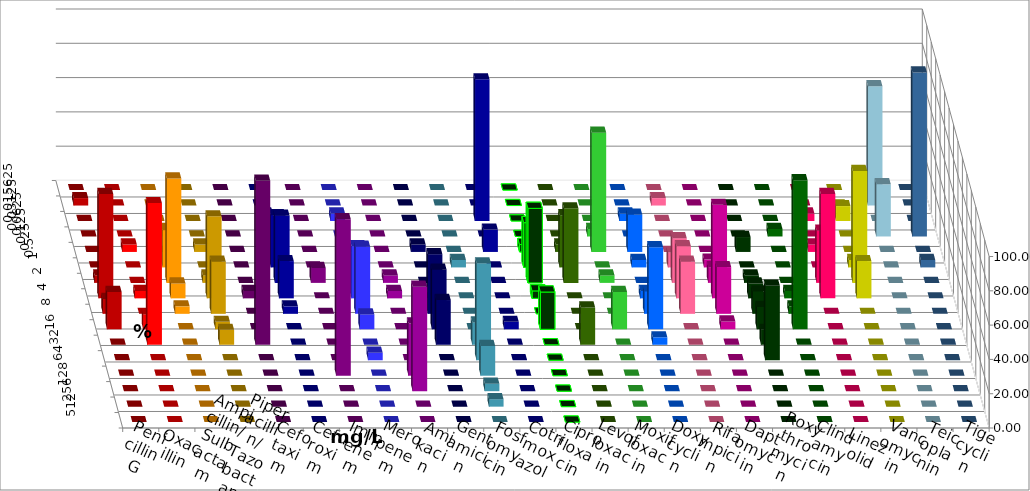
| Category | Penicillin G | Oxacillin | Ampicillin/ Sulbactam | Piperacillin/ Tazobactam | Cefotaxim | Cefuroxim | Imipenem | Meropenem | Amikacin | Gentamicin | Fosfomycin | Cotrimoxazol | Ciprofloxacin | Levofloxacin | Moxifloxacin | Doxycyclin | Rifampicin | Daptomycin | Roxythromycin | Clindamycin | Linezolid | Vancomycin | Teicoplanin | Tigecyclin |
|---|---|---|---|---|---|---|---|---|---|---|---|---|---|---|---|---|---|---|---|---|---|---|---|---|
| 0.015625 | 0 | 0 | 0 | 0 | 0 | 0 | 0 | 0 | 0 | 0 | 0 | 0 | 0 | 0 | 0 | 0 | 0 | 0 | 0 | 0 | 0 | 0 | 0 | 0 |
| 0.03125 | 4.348 | 0 | 0 | 0 | 0 | 0 | 0 | 0 | 0 | 0 | 0 | 0 | 0 | 0 | 0 | 0 | 4.348 | 0 | 0 | 0 | 0 | 0 | 0 | 69.565 |
| 0.0625 | 0 | 0 | 0 | 0 | 0 | 0 | 4.348 | 4.348 | 0 | 0 | 0 | 82.609 | 0 | 0 | 0 | 4.348 | 0 | 0 | 0 | 0 | 4.348 | 8.696 | 0 | 0 |
| 0.125 | 0 | 0 | 4.348 | 0 | 0 | 0 | 0 | 0 | 0 | 0 | 0 | 0 | 0 | 0 | 4.348 | 0 | 0 | 0 | 0 | 4.348 | 0 | 0 | 95.652 | 30.435 |
| 0.25 | 0 | 4.348 | 0 | 4.348 | 0 | 0 | 0 | 0 | 0 | 4.348 | 0 | 13.043 | 4.348 | 4.348 | 69.565 | 21.739 | 0 | 0 | 8.696 | 0 | 4.348 | 0 | 0 | 0 |
| 0.5 | 0 | 0 | 21.739 | 0 | 0 | 0 | 30.435 | 4.348 | 0 | 0 | 4.348 | 0 | 26.087 | 30.435 | 0 | 4.348 | 8.696 | 4.545 | 0 | 0 | 0 | 4.348 | 4.348 | 0 |
| 1.0 | 4.348 | 0 | 60.87 | 4.348 | 0 | 8.696 | 39.13 | 8.696 | 4.348 | 0 | 0 | 0 | 43.478 | 43.478 | 4.348 | 0 | 26.087 | 9.091 | 4.348 | 0 | 30.435 | 65.217 | 0 | 0 |
| 2.0 | 60.87 | 4.348 | 8.696 | 47.826 | 4.348 | 0 | 21.739 | 30.435 | 4.348 | 0 | 0 | 0 | 4.348 | 0 | 0 | 4.348 | 30.435 | 54.545 | 8.696 | 4.348 | 60.87 | 21.739 | 0 | 0 |
| 4.0 | 8.696 | 0 | 4.348 | 30.435 | 0 | 0 | 4.348 | 39.13 | 0 | 34.783 | 0 | 0 | 0 | 0 | 0 | 13.043 | 30.435 | 27.273 | 13.043 | 4.348 | 0 | 0 | 0 | 0 |
| 8.0 | 21.739 | 8.696 | 0 | 4.348 | 0 | 0 | 0 | 8.696 | 0 | 34.783 | 0 | 4.348 | 21.739 | 0 | 21.739 | 47.826 | 0 | 4.545 | 13.043 | 86.957 | 0 | 0 | 0 | 0 |
| 16.0 | 0 | 82.609 | 0 | 8.696 | 95.652 | 0 | 0 | 0 | 0 | 26.087 | 13.043 | 0 | 0 | 21.739 | 0 | 4.348 | 0 | 0 | 8.696 | 0 | 0 | 0 | 0 | 0 |
| 32.0 | 0 | 0 | 0 | 0 | 0 | 0 | 0 | 4.348 | 0 | 0 | 56.522 | 0 | 0 | 0 | 0 | 0 | 0 | 0 | 43.478 | 0 | 0 | 0 | 0 | 0 |
| 64.0 | 0 | 0 | 0 | 0 | 0 | 91.304 | 0 | 0 | 30.435 | 0 | 17.391 | 0 | 0 | 0 | 0 | 0 | 0 | 0 | 0 | 0 | 0 | 0 | 0 | 0 |
| 128.0 | 0 | 0 | 0 | 0 | 0 | 0 | 0 | 0 | 60.87 | 0 | 4.348 | 0 | 0 | 0 | 0 | 0 | 0 | 0 | 0 | 0 | 0 | 0 | 0 | 0 |
| 256.0 | 0 | 0 | 0 | 0 | 0 | 0 | 0 | 0 | 0 | 0 | 4.348 | 0 | 0 | 0 | 0 | 0 | 0 | 0 | 0 | 0 | 0 | 0 | 0 | 0 |
| 512.0 | 0 | 0 | 0 | 0 | 0 | 0 | 0 | 0 | 0 | 0 | 0 | 0 | 0 | 0 | 0 | 0 | 0 | 0 | 0 | 0 | 0 | 0 | 0 | 0 |